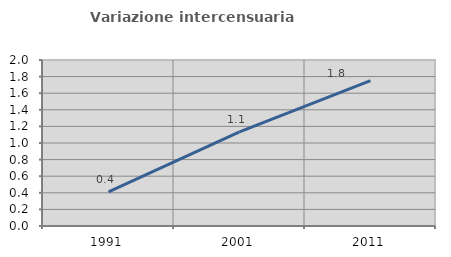
| Category | Variazione intercensuaria annua |
|---|---|
| 1991.0 | 0.411 |
| 2001.0 | 1.134 |
| 2011.0 | 1.751 |